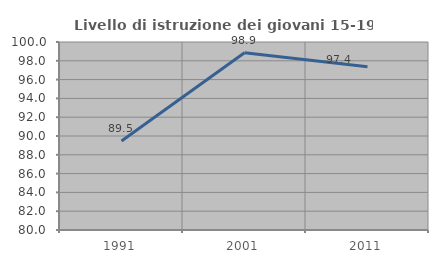
| Category | Livello di istruzione dei giovani 15-19 anni |
|---|---|
| 1991.0 | 89.474 |
| 2001.0 | 98.851 |
| 2011.0 | 97.368 |